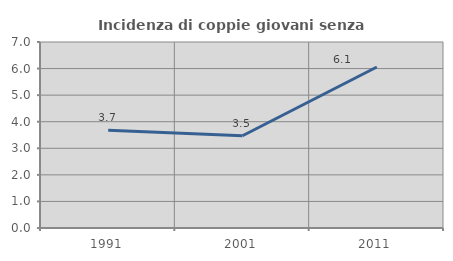
| Category | Incidenza di coppie giovani senza figli |
|---|---|
| 1991.0 | 3.678 |
| 2001.0 | 3.472 |
| 2011.0 | 6.061 |